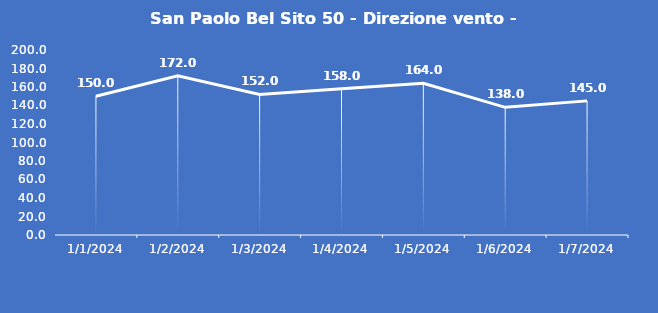
| Category | San Paolo Bel Sito 50 - Direzione vento - Grezzo (°N) |
|---|---|
| 1/1/24 | 150 |
| 1/2/24 | 172 |
| 1/3/24 | 152 |
| 1/4/24 | 158 |
| 1/5/24 | 164 |
| 1/6/24 | 138 |
| 1/7/24 | 145 |